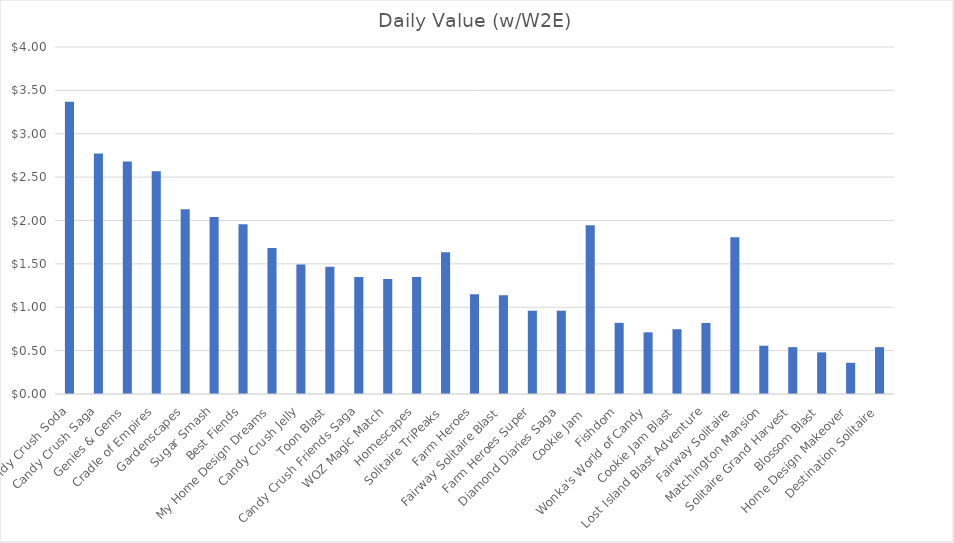
| Category | Daily Value (w/W2E) |
|---|---|
| Candy Crush Soda | 3.369 |
| Candy Crush Saga | 2.773 |
| Genies & Gems | 2.68 |
| Cradle of Empires | 2.567 |
| Gardenscapes | 2.13 |
| Sugar Smash | 2.04 |
| Best Fiends | 1.956 |
| My Home Design Dreams | 1.683 |
| Candy Crush Jelly | 1.493 |
| Toon Blast | 1.467 |
| Candy Crush Friends Saga | 1.348 |
| WOZ Magic Match | 1.327 |
| Homescapes | 1.349 |
| Solitaire TriPeaks | 1.633 |
| Farm Heroes | 1.15 |
| ​​Fairway Solitaire Blast | 1.139 |
| Farm Heroes Super | 0.96 |
| Diamond Diaries Saga | 0.96 |
| Cookie Jam  | 1.947 |
| Fishdom | 0.82 |
| Wonka's World of Candy | 0.711 |
| Cookie Jam Blast | 0.747 |
| Lost Island Blast Adventure | 0.818 |
| ​​Fairway Solitaire | 1.808 |
| Matchington Mansion | 0.557 |
| Solitaire Grand Harvest | 0.54 |
| Blossom Blast | 0.48 |
| Home Design Makeover | 0.36 |
| Destination Solitaire | 0.54 |